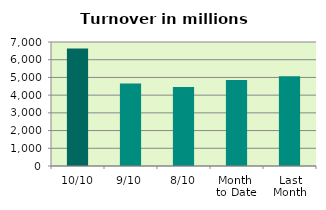
| Category | Series 0 |
|---|---|
| 10/10 | 6638.511 |
| 9/10 | 4659.947 |
| 8/10 | 4456.591 |
| Month 
to Date | 4855.733 |
| Last
Month | 5068.328 |